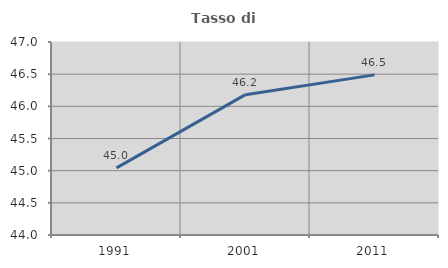
| Category | Tasso di occupazione   |
|---|---|
| 1991.0 | 45.044 |
| 2001.0 | 46.182 |
| 2011.0 | 46.489 |